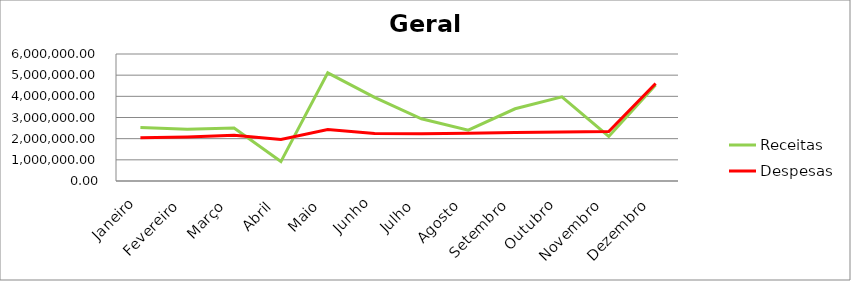
| Category | Receitas | Despesas |
|---|---|---|
| Janeiro | 2524603.47 | 2039405.97 |
| Fevereiro | 2439155.56 | 2082226.33 |
| Março | 2498642.47 | 2156464.64 |
| Abril | 917538.87 | 1963483.72 |
| Maio | 5110452.17 | 2427123.66 |
| Junho | 3952047.16 | 2244870.71 |
| Julho | 2940133.92 | 2233501.4 |
| Agosto | 2401852.63 | 2261764.93 |
| Setembro | 3412675.64 | 2296519.4 |
| Outubro | 3974120.93 | 2317817.64 |
| Novembro | 2103330.39 | 2335190.42 |
| Dezembro | 4539256.87 | 4604177.63 |